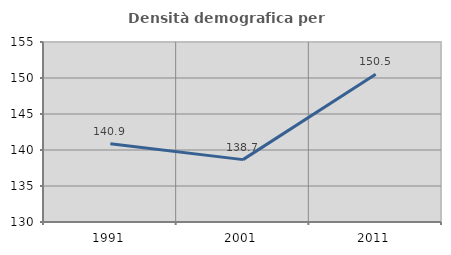
| Category | Densità demografica |
|---|---|
| 1991.0 | 140.874 |
| 2001.0 | 138.663 |
| 2011.0 | 150.513 |